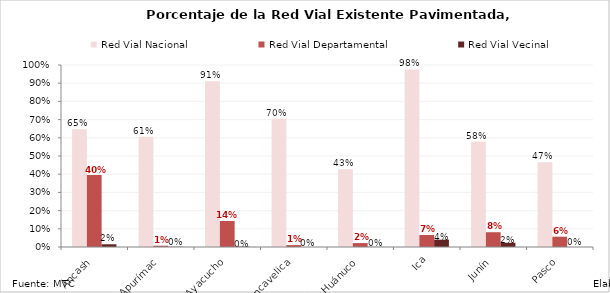
| Category | Red Vial Nacional | Red Vial Departamental | Red Vial Vecinal |
|---|---|---|---|
| Áncash | 0.646 | 0.396 | 0.015 |
| Apurímac | 0.605 | 0.007 | 0.001 |
| Ayacucho | 0.911 | 0.143 | 0.002 |
| Huancavelica | 0.704 | 0.011 | 0 |
| Huánuco | 0.427 | 0.022 | 0.001 |
| Ica | 0.975 | 0.066 | 0.04 |
| Junín | 0.579 | 0.081 | 0.023 |
| Pasco | 0.465 | 0.057 | 0 |